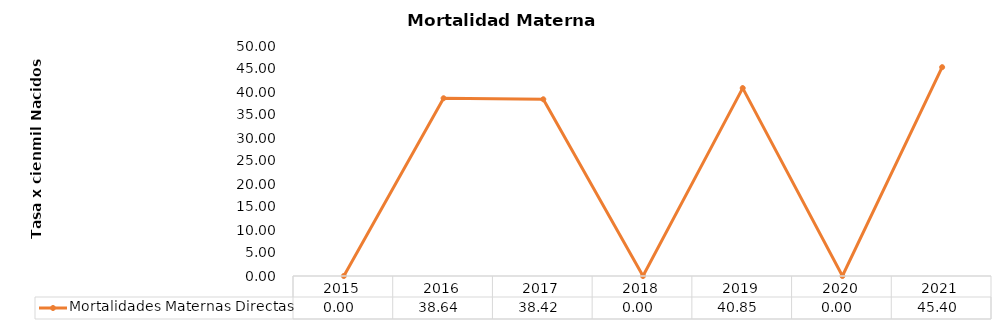
| Category | Mortalidades Maternas Directas |
|---|---|
| 0 | 0 |
| 1 | 38.64 |
| 2 | 38.417 |
| 3 | 0 |
| 4 | 40.85 |
| 5 | 0 |
| 6 | 45.4 |